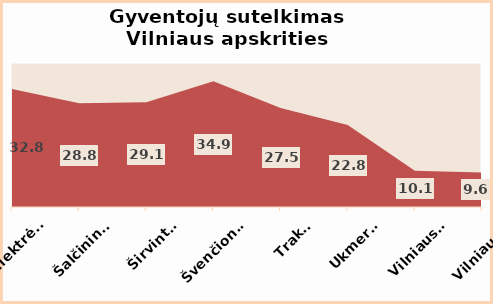
| Category | Series 0 |
|---|---|
| Elektrėnai | 32.8 |
| Šalčininkai | 28.8 |
| Širvintos | 29.1 |
| Švenčionys | 34.9 |
| Trakai | 27.5 |
| Ukmergė | 22.8 |
| Vilniaus r. | 10.1 |
| Vilniaus m. | 9.6 |